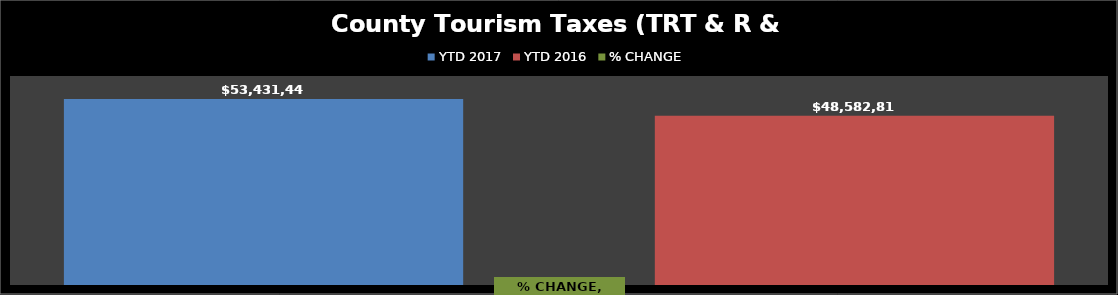
| Category | YTD 2017 | YTD 2016 |
|---|---|---|
| 0 | 53431445.98 | 48582810.961 |